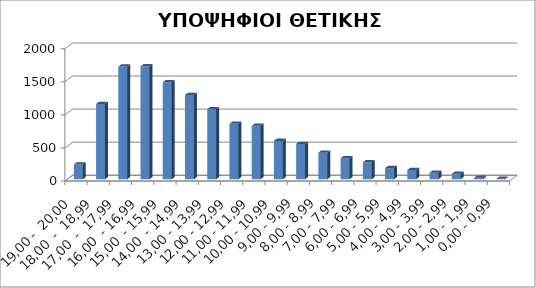
| Category | ΥΠΟΨΗΦΙΟΙ |
|---|---|
| 19,00 -  20,00 | 223 |
| 18,00  -  18,99 | 1138 |
| 17,00  -  17,99 | 1704 |
| 16,00  - 16,99 | 1707 |
| 15,00  - 15,99 | 1467 |
| 14,00  - 14,99 | 1275 |
| 13,00 - 13,99 | 1059 |
| 12,00 - 12,99 | 839 |
| 11,00 - 11,99 | 808 |
| 10,00 - 10,99 | 580 |
| 9,00 - 9,99 | 534 |
| 8,00 - 8,99 | 402 |
| 7,00 - 7,99 | 318 |
| 6,00 - 6,99 | 257 |
| 5,00 - 5,99 | 168 |
| 4,00 - 4,99 | 140 |
| 3,00 - 3,99 | 99 |
| 2,00 - 2,99 | 84 |
| 1,00 - 1,99 | 24 |
| 0,00 - 0,99 | 7 |